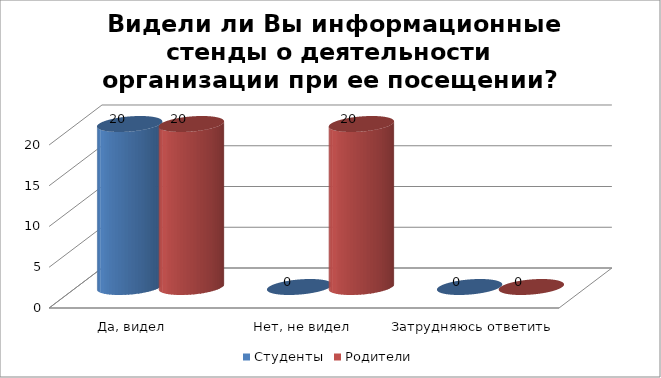
| Category | Студенты | Родители |
|---|---|---|
| Да, видел | 20 | 20 |
| Нет, не видел | 0 | 20 |
| Затрудняюсь ответить | 0 | 0 |